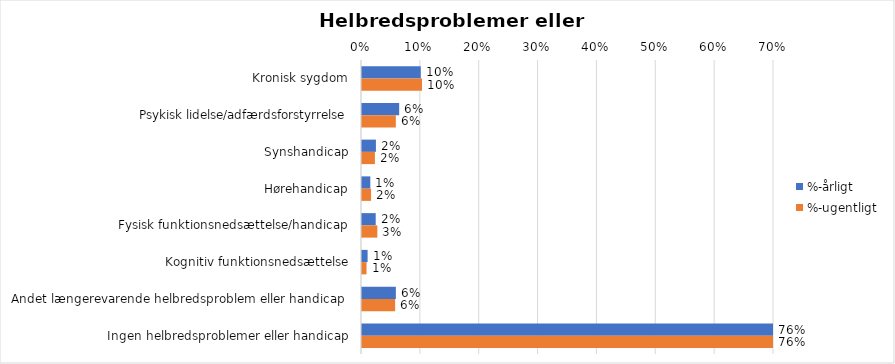
| Category | %-årligt | %-ugentligt |
|---|---|---|
| Kronisk sygdom | 0.1 | 0.102 |
| Psykisk lidelse/adfærdsforstyrrelse | 0.063 | 0.057 |
| Synshandicap | 0.024 | 0.022 |
| Hørehandicap | 0.014 | 0.015 |
| Fysisk funktionsnedsættelse/handicap | 0.023 | 0.026 |
| Kognitiv funktionsnedsættelse | 0.01 | 0.008 |
| Andet længerevarende helbredsproblem eller handicap  | 0.058 | 0.056 |
| Ingen helbredsproblemer eller handicap | 0.759 | 0.759 |